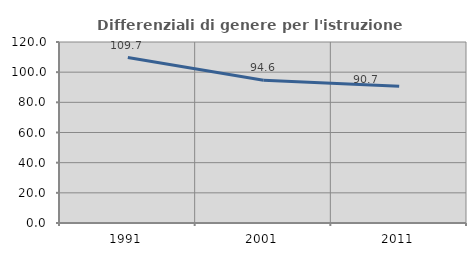
| Category | Differenziali di genere per l'istruzione superiore |
|---|---|
| 1991.0 | 109.674 |
| 2001.0 | 94.626 |
| 2011.0 | 90.665 |